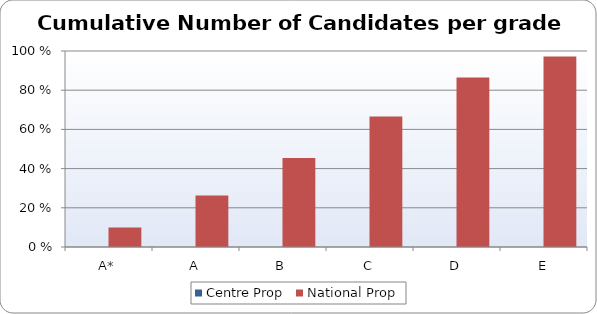
| Category | Centre Prop | National Prop |
|---|---|---|
| A* | 0 | 9.96 |
| A | 0 | 26.29 |
| B | 0 | 45.42 |
| C | 0 | 66.53 |
| D | 0 | 86.45 |
| E | 0 | 97.21 |